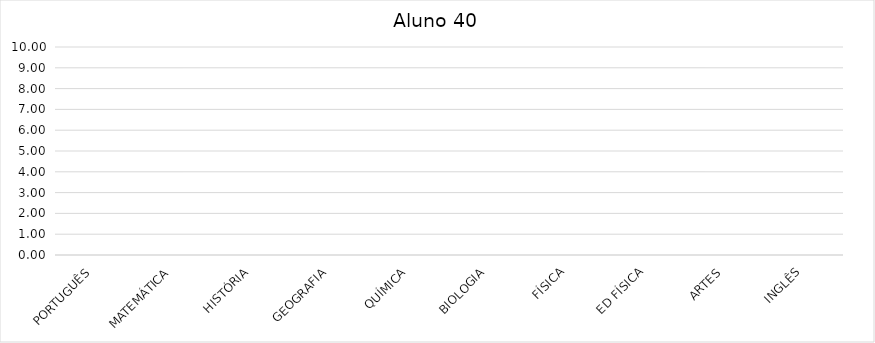
| Category | 1o Bimestre | 2o Bimestre | 3o Bimestre | 4o Bimestre |
|---|---|---|---|---|
| PORTUGUÊS | 0 | 0 | 0 | 0 |
| MATEMÁTICA | 0 | 0 | 0 | 0 |
| HISTÓRIA | 0 | 0 | 0 | 0 |
| GEOGRAFIA | 0 | 0 | 0 | 0 |
| QUÍMICA | 0 | 0 | 0 | 0 |
| BIOLOGIA | 0 | 0 | 0 | 0 |
| FÍSICA | 0 | 0 | 0 | 0 |
| ED FÍSICA | 0 | 0 | 0 | 0 |
| ARTES | 0 | 0 | 0 | 0 |
| INGLÊS | 0 | 0 | 0 | 0 |